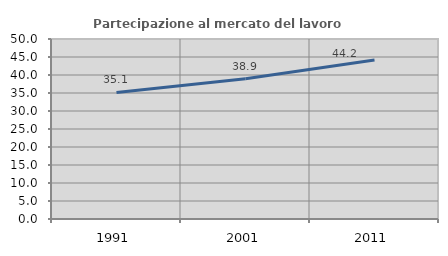
| Category | Partecipazione al mercato del lavoro  femminile |
|---|---|
| 1991.0 | 35.148 |
| 2001.0 | 38.93 |
| 2011.0 | 44.155 |